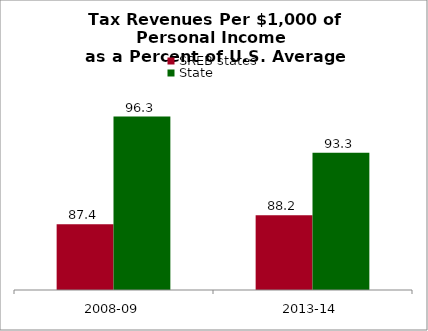
| Category | SREB states | State |
|---|---|---|
| 2008-09 | 87.423 | 96.301 |
| 2013-14 | 88.155 | 93.311 |